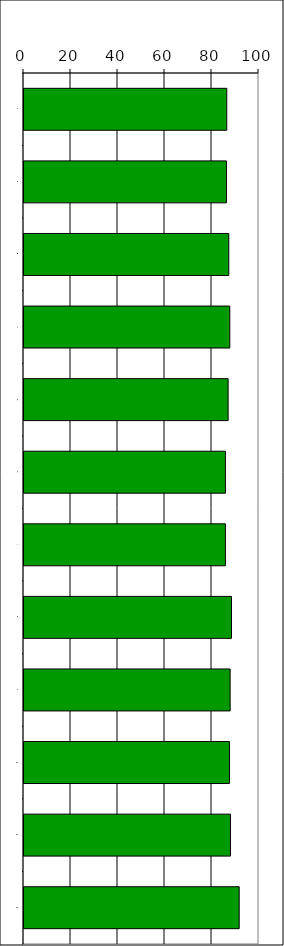
| Category | Series 0 |
|---|---|
| 0 | 86.286 |
| 1 | 86.143 |
| 2 | 87.143 |
| 3 | 87.571 |
| 4 | 86.857 |
| 5 | 85.714 |
| 6 | 85.714 |
| 7 | 88.286 |
| 8 | 87.714 |
| 9 | 87.429 |
| 10 | 87.857 |
| 11 | 91.571 |